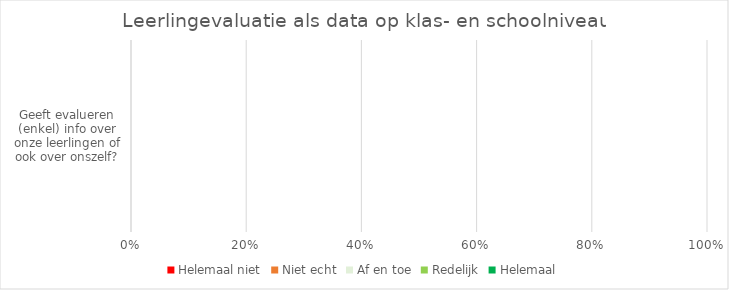
| Category | Helemaal niet | Niet echt | Af en toe | Redelijk | Helemaal |
|---|---|---|---|---|---|
| Geeft evalueren (enkel) info over onze leerlingen of ook over onszelf? | 0 | 0 | 0 | 0 | 0 |